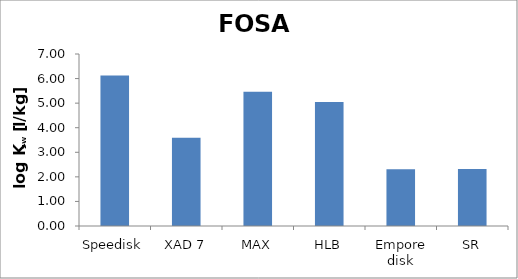
| Category | FOSA  |
|---|---|
| Speedisk | 6.129 |
| XAD 7 | 3.595 |
| MAX | 5.461 |
| HLB | 5.045 |
| Empore disk | 2.313 |
| SR | 2.323 |